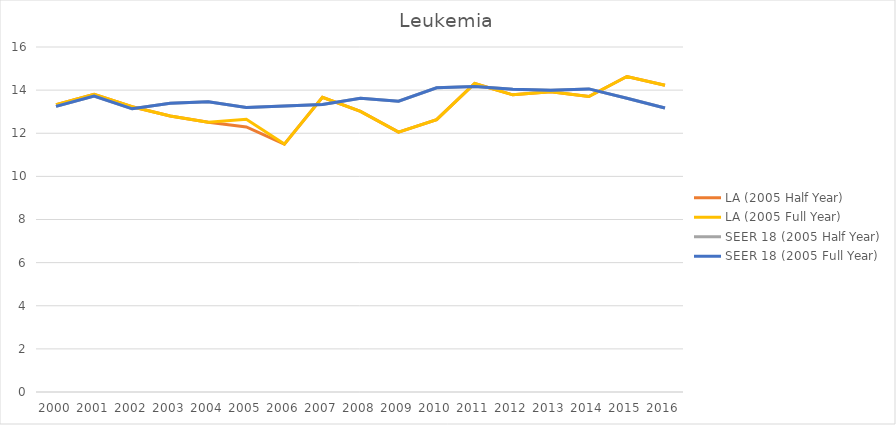
| Category | LA (2005 Half Year) | LA (2005 Full Year) | SEER 18 (2005 Half Year) | SEER 18 (2005 Full Year) |
|---|---|---|---|---|
| 2000.0 | 13.324 | 13.324 | 13.247 | 13.247 |
| 2001.0 | 13.8 | 13.8 | 13.728 | 13.728 |
| 2002.0 | 13.23 | 13.23 | 13.133 | 13.133 |
| 2003.0 | 12.802 | 12.802 | 13.396 | 13.396 |
| 2004.0 | 12.511 | 12.511 | 13.46 | 13.46 |
| 2005.0 | 12.293 | 12.65 | 13.197 | 13.192 |
| 2006.0 | 11.497 | 11.497 | 13.268 | 13.268 |
| 2007.0 | 13.664 | 13.664 | 13.338 | 13.338 |
| 2008.0 | 13.015 | 13.015 | 13.619 | 13.619 |
| 2009.0 | 12.05 | 12.05 | 13.487 | 13.487 |
| 2010.0 | 12.633 | 12.633 | 14.107 | 14.107 |
| 2011.0 | 14.309 | 14.309 | 14.172 | 14.172 |
| 2012.0 | 13.781 | 13.781 | 14.038 | 14.038 |
| 2013.0 | 13.928 | 13.928 | 13.991 | 13.991 |
| 2014.0 | 13.701 | 13.701 | 14.056 | 14.056 |
| 2015.0 | 14.633 | 14.633 | 13.627 | 13.627 |
| 2016.0 | 14.225 | 14.225 | 13.173 | 13.173 |